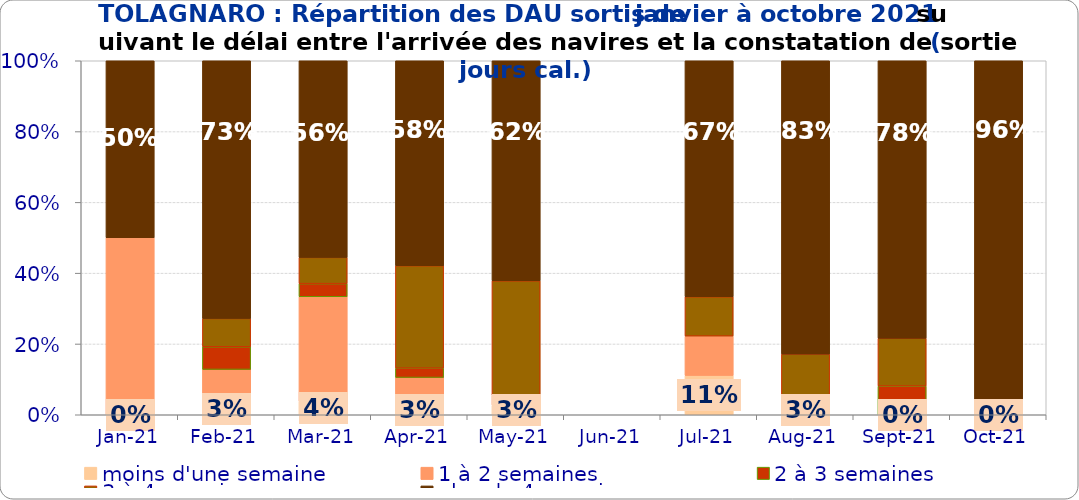
| Category | moins d'une semaine | 1 à 2 semaines | 2 à 3 semaines | 3 à 4 semaines | plus de 4 semaines |
|---|---|---|---|---|---|
| 2021-01-01 | 0 | 0.5 | 0 | 0 | 0.5 |
| 2021-02-01 | 0.032 | 0.096 | 0.064 | 0.08 | 0.728 |
| 2021-03-01 | 0.037 | 0.296 | 0.037 | 0.074 | 0.556 |
| 2021-04-01 | 0.026 | 0.079 | 0.026 | 0.289 | 0.579 |
| 2021-05-01 | 0.027 | 0.027 | 0 | 0.324 | 0.622 |
| 2021-06-01 | 0 | 0 | 0 | 0 | 0 |
| 2021-07-01 | 0.111 | 0.111 | 0 | 0.111 | 0.667 |
| 2021-08-01 | 0.029 | 0 | 0 | 0.143 | 0.829 |
| 2021-09-01 | 0 | 0 | 0.081 | 0.135 | 0.784 |
| 2021-10-01 | 0 | 0 | 0 | 0.04 | 0.96 |